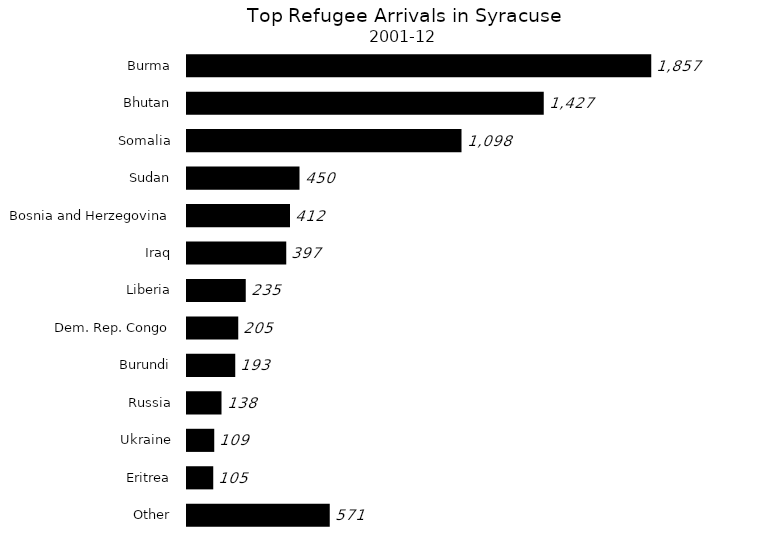
| Category | Series 0 |
|---|---|
| Other | 571 |
| Eritrea | 105 |
| Ukraine | 109 |
| Russia | 138 |
| Burundi | 193 |
| Dem. Rep. Congo | 205 |
| Liberia | 235 |
| Iraq | 397 |
| Bosnia and Herzegovina | 412 |
| Sudan | 450 |
| Somalia | 1098 |
| Bhutan | 1427 |
| Burma | 1857 |